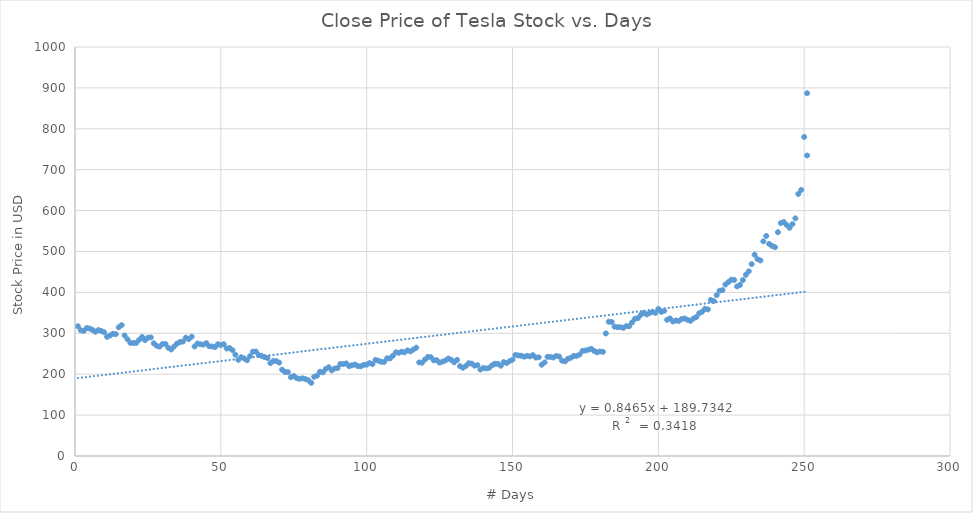
| Category | Close Price |
|---|---|
| 1.0 | 317.22 |
| 2.0 | 307.51 |
| 3.0 | 305.8 |
| 4.0 | 312.84 |
| 5.0 | 311.81 |
| 6.0 | 308.17 |
| 7.0 | 303.77 |
| 8.0 | 307.88 |
| 9.0 | 305.64 |
| 10.0 | 302.56 |
| 11.0 | 291.23 |
| 12.0 | 294.71 |
| 13.0 | 298.77 |
| 14.0 | 297.86 |
| 15.0 | 314.74 |
| 16.0 | 319.88 |
| 17.0 | 294.79 |
| 18.0 | 285.36 |
| 19.0 | 276.54 |
| 20.0 | 276.24 |
| 21.0 | 276.59 |
| 22.0 | 284.14 |
| 23.0 | 290.92 |
| 24.0 | 283.36 |
| 25.0 | 288.96 |
| 26.0 | 289.96 |
| 27.0 | 275.43 |
| 28.0 | 269.49 |
| 29.0 | 267.47 |
| 30.0 | 273.6 |
| 31.0 | 274.02 |
| 32.0 | 264.53 |
| 33.0 | 260.42 |
| 34.0 | 267.77 |
| 35.0 | 274.83 |
| 36.0 | 278.62 |
| 37.0 | 279.86 |
| 38.0 | 289.18 |
| 39.0 | 285.88 |
| 40.0 | 291.81 |
| 41.0 | 267.78 |
| 42.0 | 274.96 |
| 43.0 | 273.2 |
| 44.0 | 272.31 |
| 45.0 | 276.06 |
| 46.0 | 268.42 |
| 47.0 | 267.7 |
| 48.0 | 266.38 |
| 49.0 | 273.36 |
| 50.0 | 271.23 |
| 51.0 | 273.26 |
| 52.0 | 262.75 |
| 53.0 | 263.9 |
| 54.0 | 258.66 |
| 55.0 | 247.63 |
| 56.0 | 235.14 |
| 57.0 | 241.47 |
| 58.0 | 238.69 |
| 59.0 | 234.01 |
| 60.0 | 244.1 |
| 61.0 | 255.03 |
| 62.0 | 255.34 |
| 63.0 | 247.06 |
| 64.0 | 244.84 |
| 65.0 | 241.98 |
| 66.0 | 239.52 |
| 67.0 | 227.01 |
| 68.0 | 232.31 |
| 69.0 | 231.95 |
| 70.0 | 228.33 |
| 71.0 | 211.03 |
| 72.0 | 205.36 |
| 73.0 | 205.08 |
| 74.0 | 192.73 |
| 75.0 | 195.49 |
| 76.0 | 190.63 |
| 77.0 | 188.7 |
| 78.0 | 189.86 |
| 79.0 | 188.22 |
| 80.0 | 185.16 |
| 81.0 | 178.97 |
| 82.0 | 193.6 |
| 83.0 | 196.59 |
| 84.0 | 205.95 |
| 85.0 | 204.5 |
| 86.0 | 212.88 |
| 87.0 | 217.1 |
| 88.0 | 209.26 |
| 89.0 | 213.91 |
| 90.0 | 214.92 |
| 91.0 | 225.03 |
| 92.0 | 224.74 |
| 93.0 | 226.43 |
| 94.0 | 219.62 |
| 95.0 | 221.86 |
| 96.0 | 223.64 |
| 97.0 | 219.76 |
| 98.0 | 219.27 |
| 99.0 | 222.84 |
| 100.0 | 223.46 |
| 101.0 | 227.17 |
| 102.0 | 224.55 |
| 103.0 | 234.9 |
| 104.0 | 233.1 |
| 105.0 | 230.34 |
| 106.0 | 230.06 |
| 107.0 | 238.92 |
| 108.0 | 238.6 |
| 109.0 | 245.08 |
| 110.0 | 253.5 |
| 111.0 | 252.38 |
| 112.0 | 254.86 |
| 113.0 | 253.54 |
| 114.0 | 258.18 |
| 115.0 | 255.68 |
| 116.0 | 260.17 |
| 117.0 | 264.88 |
| 118.0 | 228.82 |
| 119.0 | 228.04 |
| 120.0 | 235.77 |
| 121.0 | 242.26 |
| 122.0 | 241.61 |
| 123.0 | 233.85 |
| 124.0 | 234.34 |
| 125.0 | 228.32 |
| 126.0 | 230.75 |
| 127.0 | 233.42 |
| 128.0 | 238.3 |
| 129.0 | 235.01 |
| 130.0 | 229.01 |
| 131.0 | 235 |
| 132.0 | 219.62 |
| 133.0 | 215.64 |
| 134.0 | 219.94 |
| 135.0 | 226.83 |
| 136.0 | 225.86 |
| 137.0 | 220.83 |
| 138.0 | 222.15 |
| 139.0 | 211.4 |
| 140.0 | 215 |
| 141.0 | 214.08 |
| 142.0 | 215.59 |
| 143.0 | 221.71 |
| 144.0 | 225.61 |
| 145.0 | 225.01 |
| 146.0 | 220.68 |
| 147.0 | 229.58 |
| 148.0 | 227.45 |
| 149.0 | 231.79 |
| 150.0 | 235.54 |
| 151.0 | 247.1 |
| 152.0 | 245.87 |
| 153.0 | 245.2 |
| 154.0 | 242.81 |
| 155.0 | 244.79 |
| 156.0 | 243.49 |
| 157.0 | 246.6 |
| 158.0 | 240.62 |
| 159.0 | 241.23 |
| 160.0 | 223.21 |
| 161.0 | 228.7 |
| 162.0 | 242.56 |
| 163.0 | 242.13 |
| 164.0 | 240.87 |
| 165.0 | 244.69 |
| 166.0 | 243.13 |
| 167.0 | 233.03 |
| 168.0 | 231.43 |
| 169.0 | 237.72 |
| 170.0 | 240.05 |
| 171.0 | 244.53 |
| 172.0 | 244.74 |
| 173.0 | 247.89 |
| 174.0 | 256.96 |
| 175.0 | 257.89 |
| 176.0 | 259.75 |
| 177.0 | 261.97 |
| 178.0 | 256.95 |
| 179.0 | 253.5 |
| 180.0 | 255.58 |
| 181.0 | 254.68 |
| 182.0 | 299.68 |
| 183.0 | 328.13 |
| 184.0 | 327.71 |
| 185.0 | 316.22 |
| 186.0 | 315.01 |
| 187.0 | 314.92 |
| 188.0 | 313.31 |
| 189.0 | 317.47 |
| 190.0 | 317.22 |
| 191.0 | 326.58 |
| 192.0 | 335.54 |
| 193.0 | 337.14 |
| 194.0 | 345.09 |
| 195.0 | 349.93 |
| 196.0 | 346.11 |
| 197.0 | 349.35 |
| 198.0 | 352.17 |
| 199.0 | 349.99 |
| 200.0 | 359.52 |
| 201.0 | 352.22 |
| 202.0 | 354.83 |
| 203.0 | 333.04 |
| 204.0 | 336.34 |
| 205.0 | 328.92 |
| 206.0 | 331.29 |
| 207.0 | 329.94 |
| 208.0 | 334.87 |
| 209.0 | 336.2 |
| 210.0 | 333.03 |
| 211.0 | 330.37 |
| 212.0 | 335.89 |
| 213.0 | 339.53 |
| 214.0 | 348.84 |
| 215.0 | 352.7 |
| 216.0 | 359.68 |
| 217.0 | 358.39 |
| 218.0 | 381.5 |
| 219.0 | 378.99 |
| 220.0 | 393.15 |
| 221.0 | 404.04 |
| 222.0 | 405.59 |
| 223.0 | 419.22 |
| 224.0 | 425.25 |
| 225.0 | 430.94 |
| 226.0 | 430.38 |
| 227.0 | 414.7 |
| 228.0 | 418.33 |
| 229.0 | 430.26 |
| 230.0 | 443.01 |
| 231.0 | 451.54 |
| 232.0 | 469.06 |
| 233.0 | 492.14 |
| 234.0 | 481.34 |
| 235.0 | 478.15 |
| 236.0 | 524.86 |
| 237.0 | 537.92 |
| 238.0 | 518.5 |
| 239.0 | 513.49 |
| 240.0 | 510.5 |
| 241.0 | 547.2 |
| 242.0 | 569.56 |
| 243.0 | 572.2 |
| 244.0 | 564.82 |
| 245.0 | 558.02 |
| 246.0 | 566.9 |
| 247.0 | 580.99 |
| 248.0 | 640.81 |
| 249.0 | 650.57 |
| 250.0 | 780 |
| 251.0 | 887.06 |
| 251.0 | 734.7 |